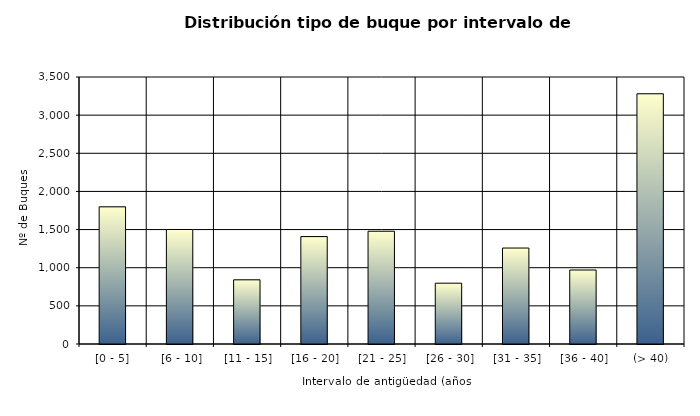
| Category | Series 0 |
|---|---|
| [0 - 5] | 1798 |
|  [6 - 10] | 1501 |
|  [11 - 15] | 841 |
|  [16 - 20] | 1408 |
|  [21 - 25] | 1478 |
|  [26 - 30] | 797 |
|  [31 - 35] | 1258 |
|  [36 - 40] | 970 |
|  (> 40) | 3280 |